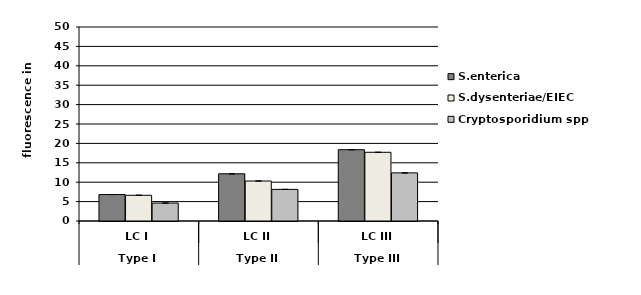
| Category | S.enterica | S.dysenteriae/EIEC | Cryptosporidium spp. |
|---|---|---|---|
| 0 | 6.82 | 6.63 | 4.63 |
| 1 | 12.164 | 10.308 | 8.15 |
| 2 | 18.378 | 17.71 | 12.4 |